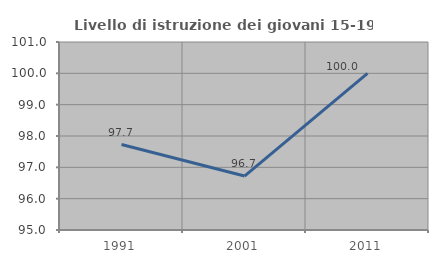
| Category | Livello di istruzione dei giovani 15-19 anni |
|---|---|
| 1991.0 | 97.727 |
| 2001.0 | 96.721 |
| 2011.0 | 100 |